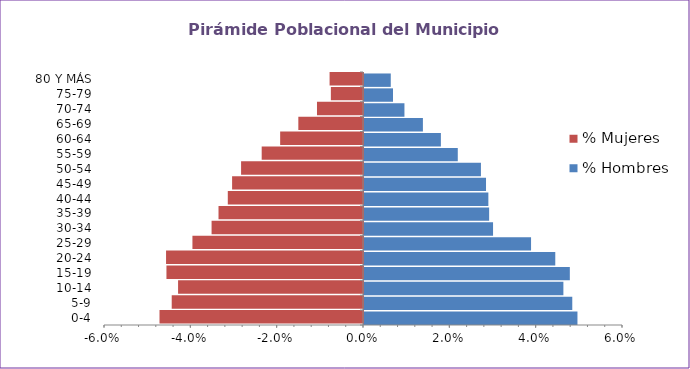
| Category | % Hombres | % Mujeres |
|---|---|---|
| 0-4 | 0.049 | -0.047 |
| 5-9 | 0.048 | -0.044 |
| 10-14 | 0.046 | -0.043 |
| 15-19 | 0.048 | -0.046 |
| 20-24 | 0.044 | -0.046 |
| 25-29 | 0.039 | -0.04 |
| 30-34 | 0.03 | -0.035 |
| 35-39 | 0.029 | -0.033 |
| 40-44 | 0.029 | -0.031 |
| 45-49 | 0.028 | -0.03 |
| 50-54 | 0.027 | -0.028 |
| 55-59 | 0.022 | -0.023 |
| 60-64 | 0.018 | -0.019 |
| 65-69 | 0.014 | -0.015 |
| 70-74 | 0.009 | -0.011 |
| 75-79 | 0.007 | -0.007 |
| 80 Y MÁS | 0.006 | -0.008 |